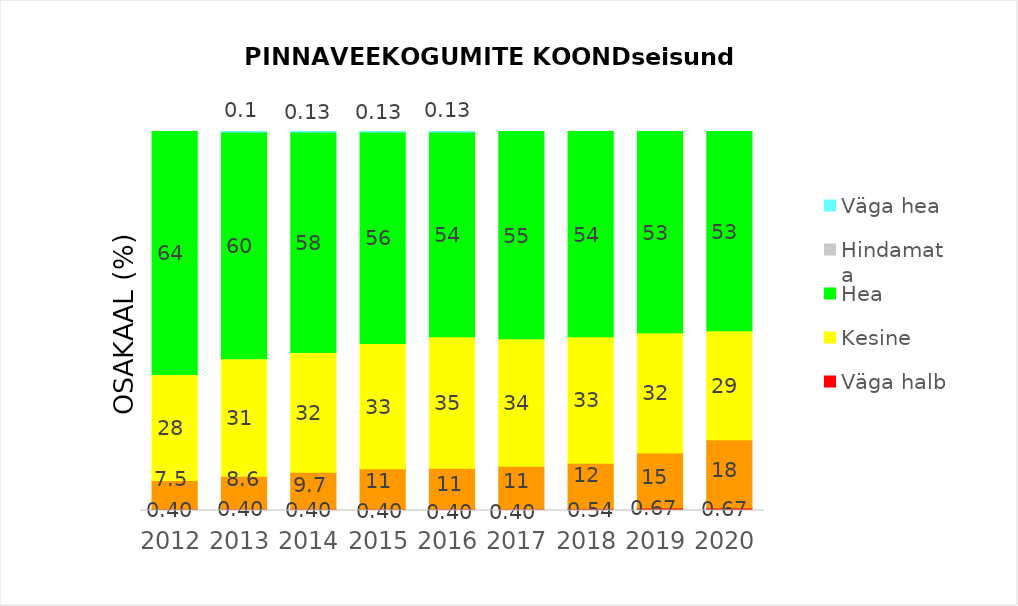
| Category | Väga halb | Halb | Kesine | Hea | Hindamata | Väga hea |
|---|---|---|---|---|---|---|
| 2012.0 | 0.403 | 7.527 | 27.957 | 64.113 | 0 | 0 |
| 2013.0 | 0.403 | 8.602 | 31.048 | 59.812 | 0 | 0.134 |
| 2014.0 | 0.403 | 9.677 | 31.586 | 58.199 | 0 | 0.134 |
| 2015.0 | 0.403 | 10.618 | 33.065 | 55.78 | 0 | 0.134 |
| 2016.0 | 0.403 | 10.753 | 34.677 | 54.032 | 0 | 0.134 |
| 2017.0 | 0.403 | 11.29 | 33.602 | 54.704 | 0 | 0 |
| 2018.0 | 0.538 | 11.962 | 33.333 | 54.167 | 0 | 0 |
| 2019.0 | 0.672 | 14.516 | 31.72 | 53.091 | 0 | 0 |
| 2020.0 | 0.672 | 18.011 | 28.763 | 52.554 | 0 | 0 |